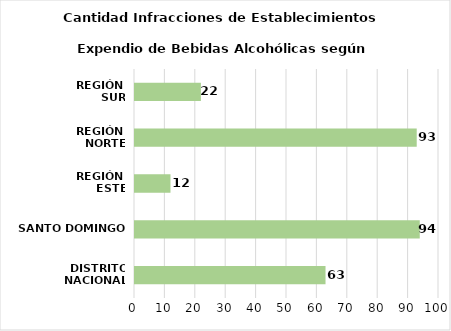
| Category | Series 0 |
|---|---|
| DISTRITO NACIONAL | 63 |
| SANTO DOMINGO | 94 |
| REGIÓN 
ESTE | 12 |
| REGIÓN 
NORTE | 93 |
| REGIÓN 
SUR | 22 |